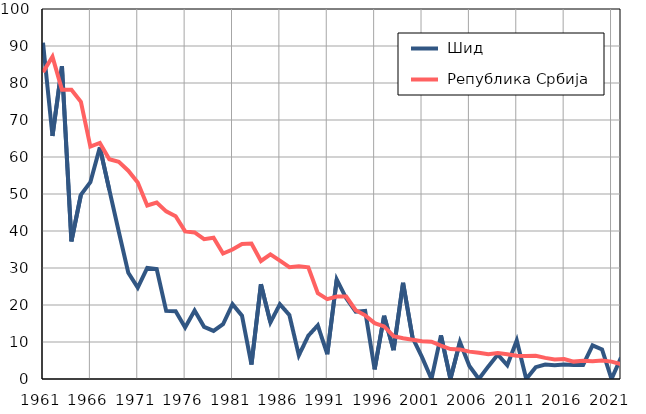
| Category |  Шид |  Република Србија |
|---|---|---|
| 1961.0 | 90.9 | 82.9 |
| 1962.0 | 65.7 | 87.1 |
| 1963.0 | 84.5 | 78.2 |
| 1964.0 | 37.2 | 78.2 |
| 1965.0 | 49.8 | 74.9 |
| 1966.0 | 53.2 | 62.8 |
| 1967.0 | 62.6 | 63.8 |
| 1968.0 | 51.1 | 59.4 |
| 1969.0 | 39.8 | 58.7 |
| 1970.0 | 28.7 | 56.3 |
| 1971.0 | 24.7 | 53.1 |
| 1972.0 | 30 | 46.9 |
| 1973.0 | 29.7 | 47.7 |
| 1974.0 | 18.4 | 45.3 |
| 1975.0 | 18.3 | 44 |
| 1976.0 | 13.9 | 39.9 |
| 1977.0 | 18.5 | 39.6 |
| 1978.0 | 14.1 | 37.8 |
| 1979.0 | 13 | 38.2 |
| 1980.0 | 14.8 | 33.9 |
| 1981.0 | 20.2 | 35 |
| 1982.0 | 17.1 | 36.5 |
| 1983.0 | 3.9 | 36.6 |
| 1984.0 | 25.6 | 31.9 |
| 1985.0 | 15.3 | 33.7 |
| 1986.0 | 20.2 | 32 |
| 1987.0 | 17.3 | 30.2 |
| 1988.0 | 6.4 | 30.5 |
| 1989.0 | 11.7 | 30.2 |
| 1990.0 | 14.5 | 23.2 |
| 1991.0 | 6.7 | 21.6 |
| 1992.0 | 26.9 | 22.3 |
| 1993.0 | 21.8 | 22.3 |
| 1994.0 | 18.2 | 18.6 |
| 1995.0 | 18.4 | 17.2 |
| 1996.0 | 2.6 | 15.1 |
| 1997.0 | 17.1 | 14.2 |
| 1998.0 | 7.8 | 11.6 |
| 1999.0 | 26 | 11 |
| 2000.0 | 11.2 | 10.6 |
| 2001.0 | 5.9 | 10.2 |
| 2002.0 | 0 | 10.1 |
| 2003.0 | 11.8 | 9 |
| 2004.0 | 0 | 8.1 |
| 2005.0 | 10 | 8 |
| 2006.0 | 3.5 | 7.4 |
| 2007.0 | 0 | 7.1 |
| 2008.0 | 3.4 | 6.7 |
| 2009.0 | 6.6 | 7 |
| 2010.0 | 3.7 | 6.7 |
| 2011.0 | 10.4 | 6.3 |
| 2012.0 | 0 | 6.2 |
| 2013.0 | 3.2 | 6.3 |
| 2014.0 | 3.9 | 5.7 |
| 2015.0 | 3.7 | 5.3 |
| 2016.0 | 3.9 | 5.4 |
| 2017.0 | 3.8 | 4.7 |
| 2018.0 | 3.8 | 4.9 |
| 2019.0 | 9.1 | 4.8 |
| 2020.0 | 8 | 5 |
| 2021.0 | 0 | 4.7 |
| 2022.0 | 5.8 | 4 |